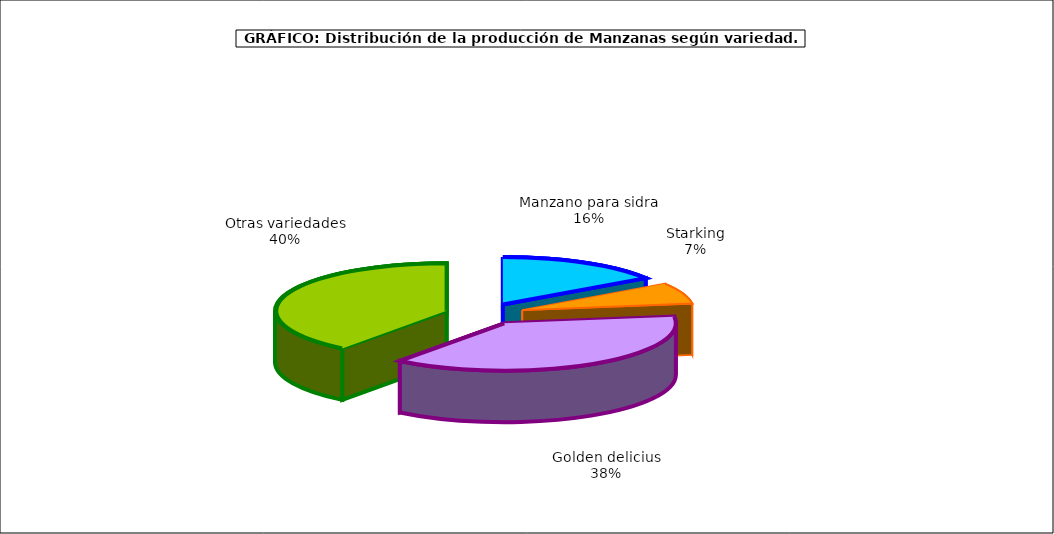
| Category | produccion |
|---|---|
| 0 | 77.862 |
| 1 | 35.42 |
| 2 | 187.344 |
| 3 | 197.053 |